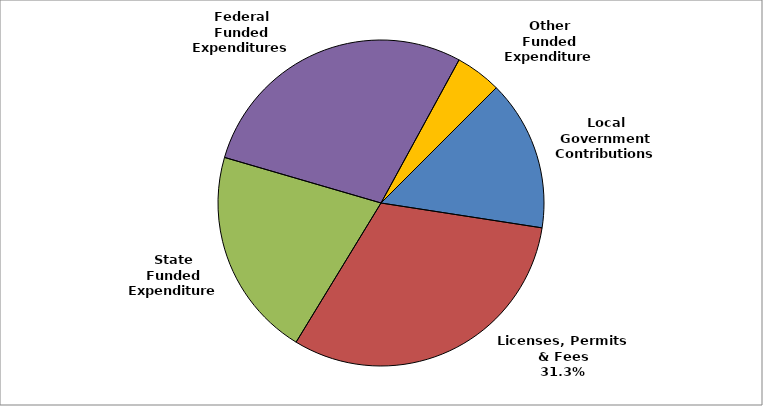
| Category | Series 0 |
|---|---|
| Local Government Contributions | 0.149 |
| Licenses, Permits & Fees | 0.313 |
| State Funded Expenditures | 0.208 |
| Federal Funded Expenditures | 0.284 |
| Other Funded Expenditures | 0.046 |